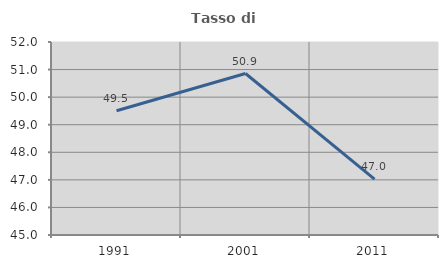
| Category | Tasso di occupazione   |
|---|---|
| 1991.0 | 49.508 |
| 2001.0 | 50.857 |
| 2011.0 | 47.025 |